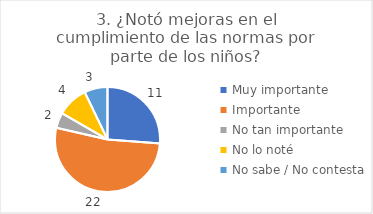
| Category | 3. ¿Notó mejoras en el cumplimiento de las normas por parte de los niños? |
|---|---|
| Muy importante  | 0.262 |
| Importante  | 0.524 |
| No tan importante  | 0.048 |
| No lo noté  | 0.095 |
| No sabe / No contesta | 0.071 |